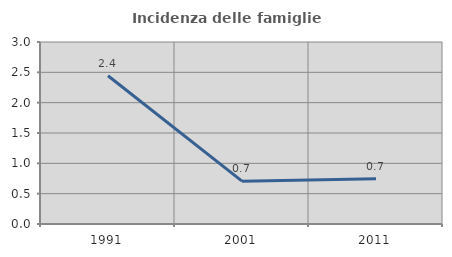
| Category | Incidenza delle famiglie numerose |
|---|---|
| 1991.0 | 2.443 |
| 2001.0 | 0.706 |
| 2011.0 | 0.745 |